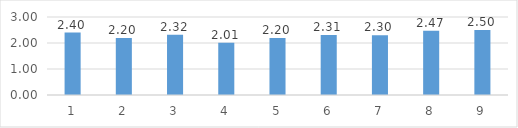
| Category | Series 0 |
|---|---|
| 0 | 2.4 |
| 1 | 2.195 |
| 2 | 2.32 |
| 3 | 2.005 |
| 4 | 2.195 |
| 5 | 2.31 |
| 6 | 2.3 |
| 7 | 2.47 |
| 8 | 2.5 |